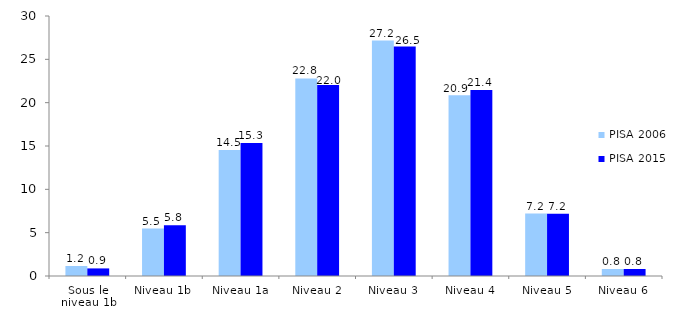
| Category | PISA 2006 | PISA 2015 |
|---|---|---|
| Sous le niveau 1b | 1.152 | 0.875 |
| Niveau 1b | 5.48 | 5.844 |
| Niveau 1a | 14.545 | 15.341 |
| Niveau 2 | 22.796 | 22.03 |
| Niveau 3 | 27.165 | 26.476 |
| Niveau 4 | 20.857 | 21.447 |
| Niveau 5 | 7.198 | 7.181 |
| Niveau 6 | 0.806 | 0.805 |